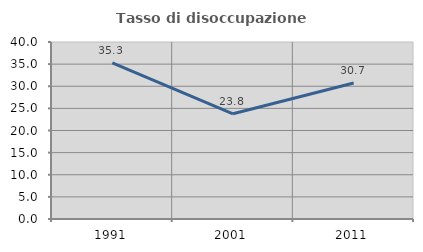
| Category | Tasso di disoccupazione giovanile  |
|---|---|
| 1991.0 | 35.301 |
| 2001.0 | 23.77 |
| 2011.0 | 30.732 |